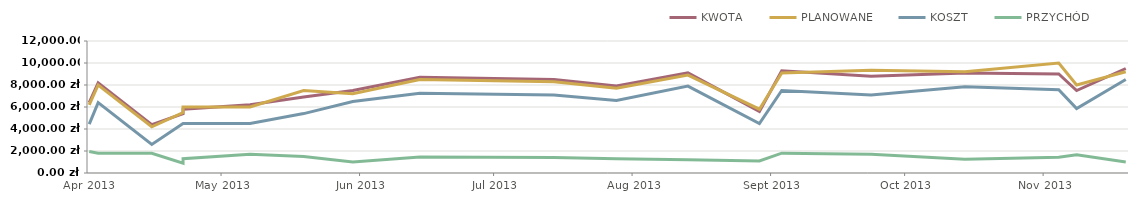
| Category | KWOTA | PLANOWANE | KOSZT | PRZYCHÓD |
|---|---|---|---|---|
| 2013-04-23 | 6400 | 6200 | 4450 | 1950 |
| 2013-04-25 | 8200 | 8000 | 6400 | 1800 |
| 2013-05-07 | 4400 | 4200 | 2600 | 1800 |
| 2013-05-14 | 5400 | 5500 | 4500 | 900 |
| 2013-05-14 | 5800 | 6000 | 4500 | 1300 |
| 2013-05-29 | 6200 | 6000 | 4500 | 1700 |
| 2013-06-10 | 6900 | 7500 | 5400 | 1500 |
| 2013-06-21 | 7500 | 7200 | 6500 | 1000 |
| 2013-07-06 | 8700 | 8500 | 7250 | 1450 |
| 2013-08-05 | 8500 | 8300 | 7100 | 1400 |
| 2013-08-19 | 7900 | 7700 | 6600 | 1300 |
| 2013-09-04 | 9100 | 8900 | 7900 | 1200 |
| 2013-09-20 | 5600 | 5800 | 4500 | 1100 |
| 2013-09-25 | 9300 | 9100 | 7500 | 1800 |
| 2013-10-15 | 8800 | 9350 | 7100 | 1700 |
| 2013-11-05 | 9100 | 9200 | 7850 | 1250 |
| 2013-11-26 | 9000 | 10000 | 7575 | 1425 |
| 2013-11-30 | 7500 | 8000 | 5850 | 1650 |
| 2013-12-11 | 9500 | 9200 | 8500 | 1000 |